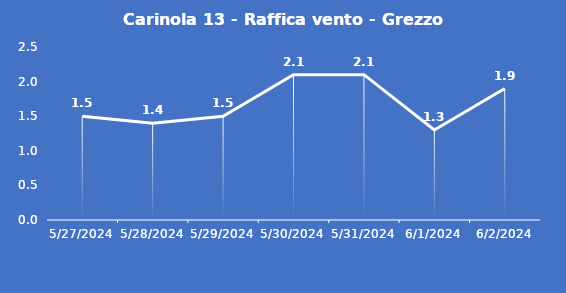
| Category | Carinola 13 - Raffica vento - Grezzo (m/s) |
|---|---|
| 5/27/24 | 1.5 |
| 5/28/24 | 1.4 |
| 5/29/24 | 1.5 |
| 5/30/24 | 2.1 |
| 5/31/24 | 2.1 |
| 6/1/24 | 1.3 |
| 6/2/24 | 1.9 |